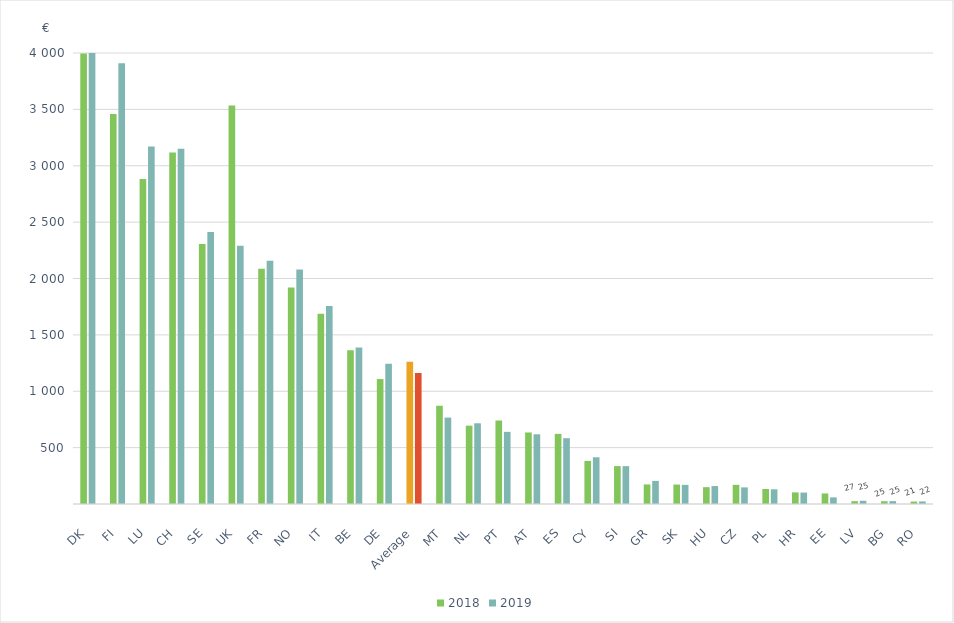
| Category | 2018 | 2019 |
|---|---|---|
| DK | 3994.839 | 4143.969 |
| FI | 3458.108 | 3908.72 |
| LU | 2881.988 | 3170.186 |
| CH | 3117.376 | 3150.259 |
| SE | 2306.002 | 2411.555 |
| UK | 3535.217 | 2290.649 |
| FR | 2087.465 | 2157.167 |
| NO | 1919.963 | 2079.131 |
| IT | 1687.191 | 1756.342 |
| BE | 1364.302 | 1387.323 |
| DE | 1108 | 1243.303 |
| Average | 1262.46 | 1162.788 |
| MT | 871.472 | 766.393 |
| NL | 694.718 | 715.883 |
| PT | 740.592 | 639.946 |
| AT | 634.304 | 618.144 |
| ES | 621.945 | 583.697 |
| CY | 381.84 | 414.431 |
| SI | 336.236 | 335.786 |
| GR | 173.631 | 204.949 |
| SK | 172.511 | 169.712 |
| HU | 149.038 | 159.232 |
| CZ | 169.926 | 147.297 |
| PL | 132.971 | 130.313 |
| HR | 102.907 | 101.397 |
| EE | 93.622 | 58.725 |
| LV | 25.124 | 28.75 |
| BG | 24.586 | 25.565 |
| RO | 21.515 | 22.773 |